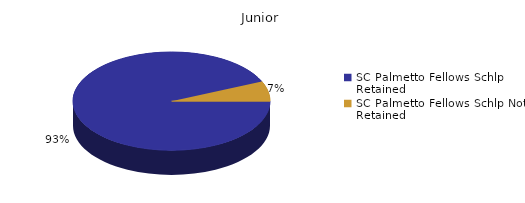
| Category | Junior |
|---|---|
| SC Palmetto Fellows Schlp Retained  | 514 |
| SC Palmetto Fellows Schlp Not Retained  | 36 |